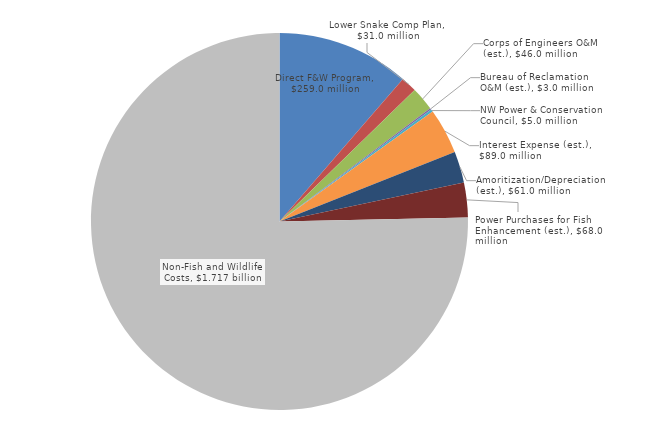
| Category | Series 0 |
|---|---|
| Direct F&W Program | 259 |
| Lower Snake Comp Plan | 31 |
| Corps of Engineers O&M (est.) | 46 |
| Bureau of Reclamation O&M (est.) | 3 |
| NW Power & Conservation Council | 5 |
| Interest Expense (est.) | 89 |
| Amoritization/Depreciation (est.) | 61 |
| Power Purchases for Fish Enhancement (est.) | 68 |
| Non-Fish and Wildlife Costs | 1717 |